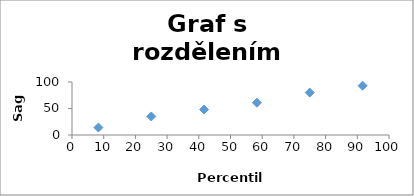
| Category | Series 0 |
|---|---|
| 8.333333333333334 | 14 |
| 25.0 | 35 |
| 41.66666666666667 | 48 |
| 58.333333333333336 | 61 |
| 75.0 | 80 |
| 91.66666666666667 | 93 |